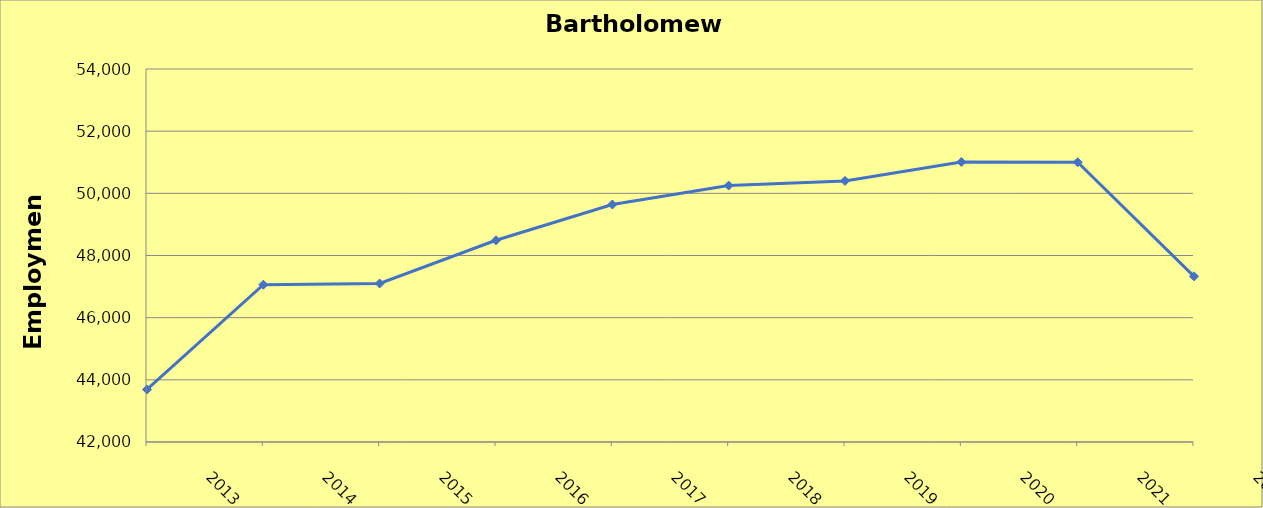
| Category | Bartholomew County |
|---|---|
| 2013.0 | 43690 |
| 2014.0 | 47060 |
| 2015.0 | 47100 |
| 2016.0 | 48490 |
| 2017.0 | 49640 |
| 2018.0 | 50250 |
| 2019.0 | 50400 |
| 2020.0 | 51010 |
| 2021.0 | 51000 |
| 2022.0 | 47330 |